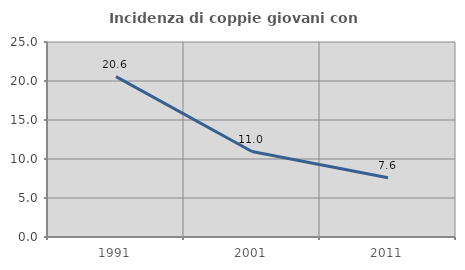
| Category | Incidenza di coppie giovani con figli |
|---|---|
| 1991.0 | 20.566 |
| 2001.0 | 10.959 |
| 2011.0 | 7.589 |